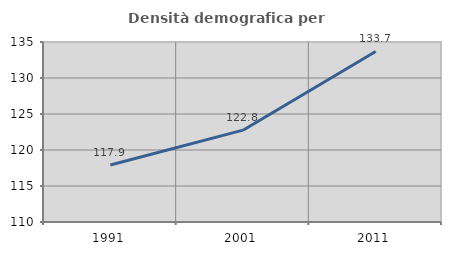
| Category | Densità demografica |
|---|---|
| 1991.0 | 117.924 |
| 2001.0 | 122.754 |
| 2011.0 | 133.689 |